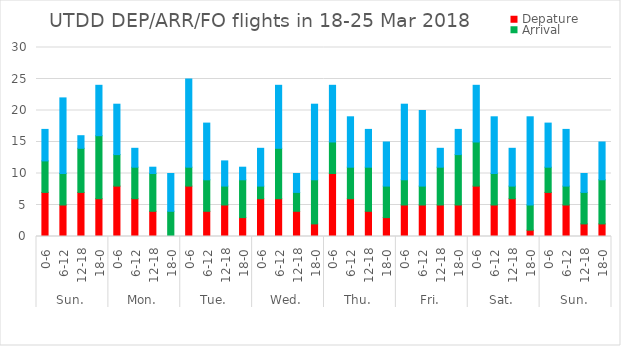
| Category | Depature | Arrival | Flyover |
|---|---|---|---|
| 0 | 7 | 5 | 5 |
| 1 | 5 | 5 | 12 |
| 2 | 7 | 7 | 2 |
| 3 | 6 | 10 | 8 |
| 4 | 8 | 5 | 8 |
| 5 | 6 | 5 | 3 |
| 6 | 4 | 6 | 1 |
| 7 | 0 | 4 | 6 |
| 8 | 8 | 3 | 14 |
| 9 | 4 | 5 | 9 |
| 10 | 5 | 3 | 4 |
| 11 | 3 | 6 | 2 |
| 12 | 6 | 2 | 6 |
| 13 | 6 | 8 | 10 |
| 14 | 4 | 3 | 3 |
| 15 | 2 | 7 | 12 |
| 16 | 10 | 5 | 9 |
| 17 | 6 | 5 | 8 |
| 18 | 4 | 7 | 6 |
| 19 | 3 | 5 | 7 |
| 20 | 5 | 4 | 12 |
| 21 | 5 | 3 | 12 |
| 22 | 5 | 6 | 3 |
| 23 | 5 | 8 | 4 |
| 24 | 8 | 7 | 9 |
| 25 | 5 | 5 | 9 |
| 26 | 6 | 2 | 6 |
| 27 | 1 | 4 | 14 |
| 28 | 7 | 4 | 7 |
| 29 | 5 | 3 | 9 |
| 30 | 2 | 5 | 3 |
| 31 | 2 | 7 | 6 |